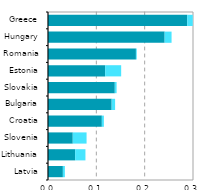
| Category |  ICT services  |   ICT manufacturing |
|---|---|---|
| Latvia | 0.031 | 0.004 |
| Lithuania | 0.056 | 0.021 |
| Slovenia | 0.051 | 0.029 |
| Croatia | 0.111 | 0.004 |
| Bulgaria | 0.132 | 0.007 |
| Slovakia | 0.138 | 0.004 |
| Estonia | 0.118 | 0.033 |
| Romania | 0.182 | 0.002 |
| Hungary | 0.241 | 0.014 |
| Greece | 0.288 | 0.011 |